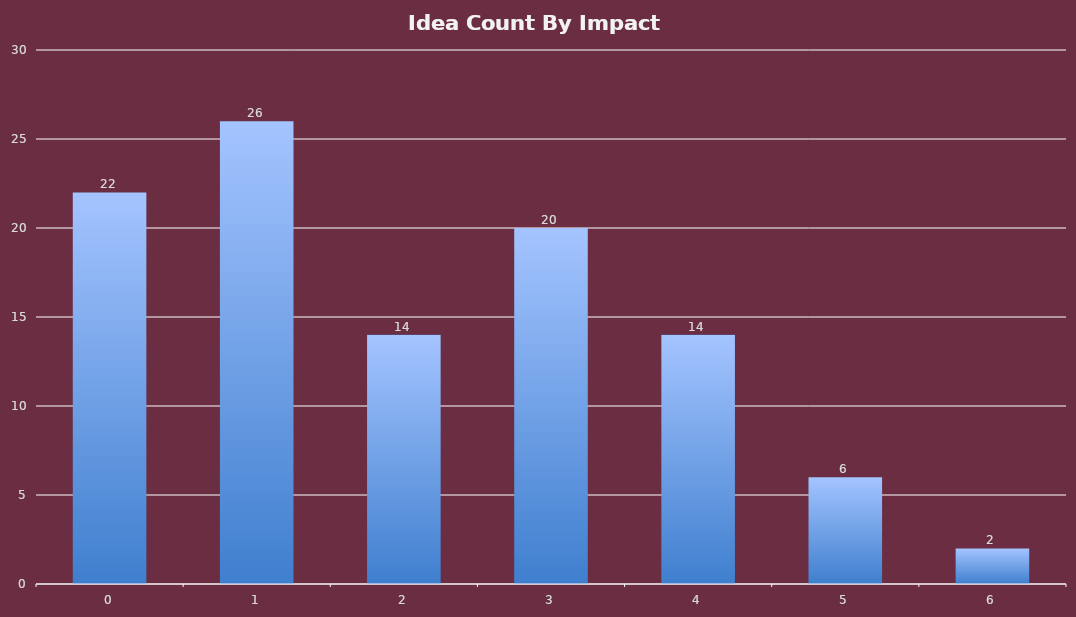
| Category | Total |
|---|---|
| 0 | 22 |
| 1 | 26 |
| 2 | 14 |
| 3 | 20 |
| 4 | 14 |
| 5 | 6 |
| 6 | 2 |